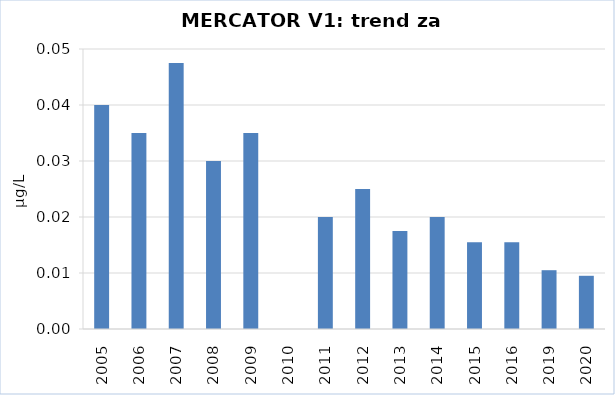
| Category | Vsota |
|---|---|
| 2005 | 0.04 |
| 2006 | 0.035 |
| 2007 | 0.048 |
| 2008 | 0.03 |
| 2009 | 0.035 |
| 2010 | 0 |
| 2011 | 0.02 |
| 2012 | 0.025 |
| 2013 | 0.018 |
| 2014 | 0.02 |
| 2015 | 0.016 |
| 2016 | 0.016 |
| 2019 | 0.01 |
| 2020 | 0.01 |